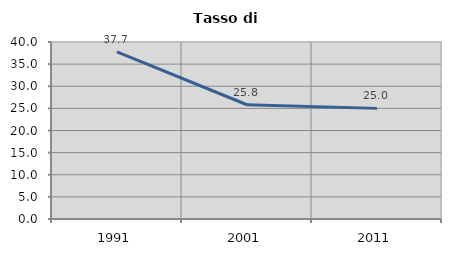
| Category | Tasso di disoccupazione   |
|---|---|
| 1991.0 | 37.748 |
| 2001.0 | 25.818 |
| 2011.0 | 25 |